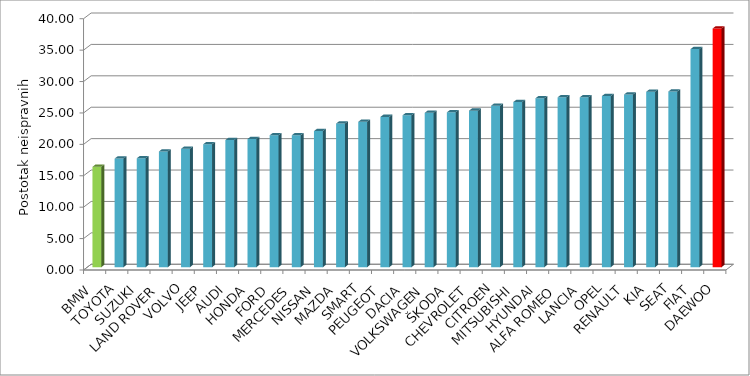
| Category | Series 4 |
|---|---|
| BMW | 15.977 |
| TOYOTA | 17.283 |
| SUZUKI | 17.332 |
| LAND ROVER | 18.42 |
| VOLVO | 18.843 |
| JEEP | 19.567 |
| AUDI | 20.229 |
| HONDA | 20.398 |
| FORD | 20.994 |
| MERCEDES | 21.006 |
| NISSAN | 21.661 |
| MAZDA | 22.87 |
| SMART | 23.143 |
| PEUGEOT | 23.92 |
| DACIA | 24.174 |
| VOLKSWAGEN | 24.574 |
| ŠKODA | 24.652 |
| CHEVROLET | 24.912 |
| CITROEN | 25.705 |
| MITSUBISHI | 26.282 |
| HYUNDAI | 26.889 |
| ALFA ROMEO | 27.032 |
| LANCIA | 27.033 |
| OPEL | 27.245 |
| RENAULT | 27.487 |
| KIA | 27.92 |
| SEAT | 27.966 |
| FIAT | 34.71 |
| DAEWOO | 37.999 |